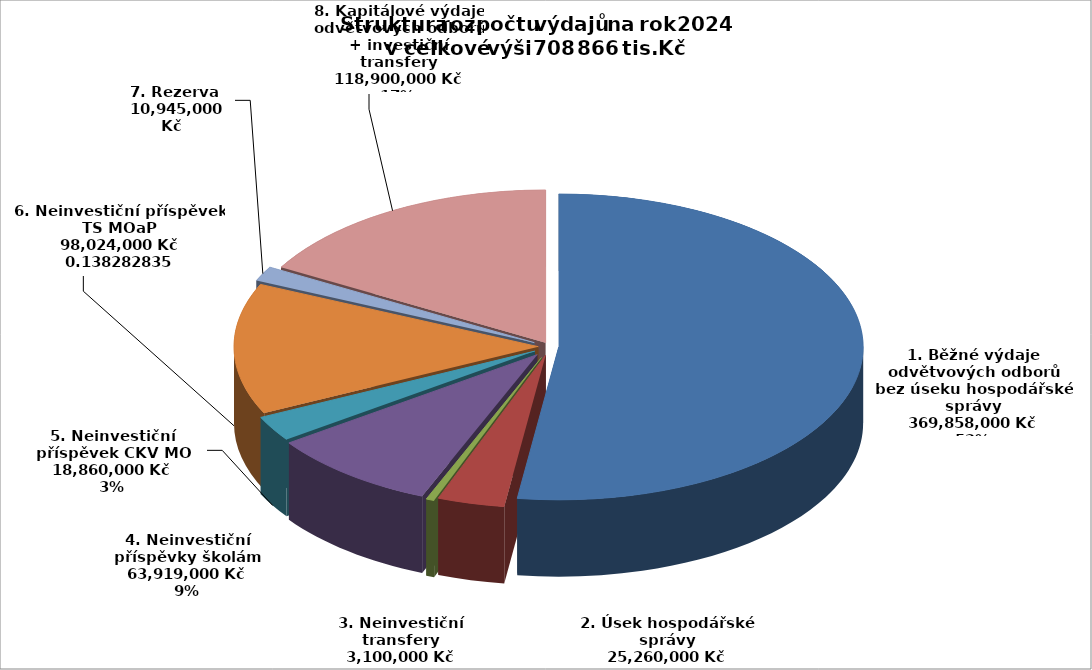
| Category | Series 0 |
|---|---|
| 1. Běžné výdaje odvětvových odborů bez úseku hospodářské správy | 369858000 |
| 2. Úsek hospodářské správy | 25260000 |
| 3. Neinvestiční transfery | 3100000 |
| 4. Neinvestiční příspěvky školám | 63919000 |
| 5. Neinvestiční příspěvek CKV MO | 18860000 |
| 6. Neinvestiční příspěvek TS MOaP | 98024000 |
| 7. Rezerva | 10945000 |
| 8. Kapitálové výdaje odvětvových odborů + investiční transfery | 118900000 |